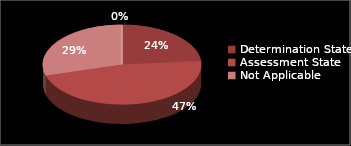
| Category | Series 0 |
|---|---|
| Determination State | 12 |
| Assessment State | 24 |
| Not Applicable | 15 |